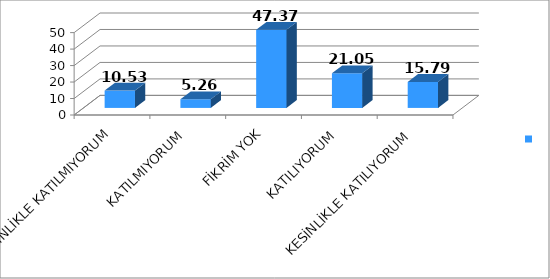
| Category | Series 0 |
|---|---|
| KESİNLİKLE KATILMIYORUM | 10.53 |
| KATILMIYORUM | 5.26 |
| FİKRİM YOK | 47.37 |
| KATILIYORUM | 21.05 |
| KESİNLİKLE KATILIYORUM | 15.79 |